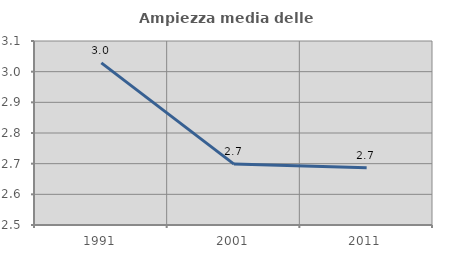
| Category | Ampiezza media delle famiglie |
|---|---|
| 1991.0 | 3.029 |
| 2001.0 | 2.699 |
| 2011.0 | 2.686 |